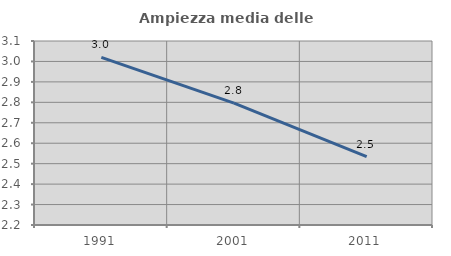
| Category | Ampiezza media delle famiglie |
|---|---|
| 1991.0 | 3.02 |
| 2001.0 | 2.796 |
| 2011.0 | 2.534 |